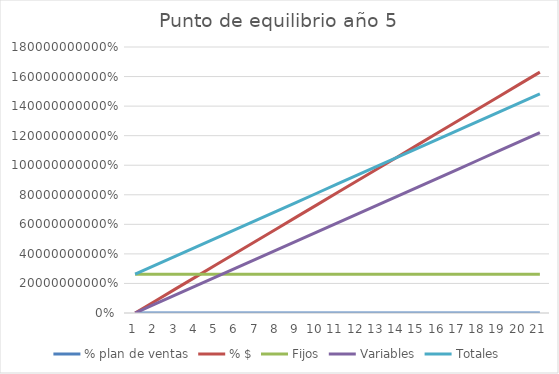
| Category | % plan de ventas | % $ | Fijos | Variables | Totales |
|---|---|---|---|---|---|
| 0 | 0 | 0 | 263004650.022 | 0 | 263004650.022 |
| 1 | 0.05 | 81506250 | 263004650.022 | 61003673.154 | 324008323.176 |
| 2 | 0.1 | 163012500 | 263004650.022 | 122007346.309 | 385011996.33 |
| 3 | 0.15 | 244518750 | 263004650.022 | 183011019.463 | 446015669.485 |
| 4 | 0.2 | 326025000 | 263004650.022 | 244014692.618 | 507019342.639 |
| 5 | 0.25 | 407531250 | 263004650.022 | 305018365.772 | 568023015.794 |
| 6 | 0.3 | 489037500 | 263004650.022 | 366022038.926 | 629026688.948 |
| 7 | 0.35 | 570543750 | 263004650.022 | 427025712.081 | 690030362.102 |
| 8 | 0.4 | 652050000 | 263004650.022 | 488029385.235 | 751034035.257 |
| 9 | 0.45 | 733556250 | 263004650.022 | 549033058.39 | 812037708.411 |
| 10 | 0.5 | 815062500 | 263004650.022 | 610036731.544 | 873041381.565 |
| 11 | 0.55 | 896568750 | 263004650.022 | 671040404.698 | 934045054.72 |
| 12 | 0.6 | 978075000 | 263004650.022 | 732044077.853 | 995048727.874 |
| 13 | 0.65 | 1059581250 | 263004650.022 | 793047751.007 | 1056052401.029 |
| 14 | 0.7 | 1141087500 | 263004650.022 | 854051424.162 | 1117056074.183 |
| 15 | 0.75 | 1222593750 | 263004650.022 | 915055097.316 | 1178059747.337 |
| 16 | 0.8 | 1304100000 | 263004650.022 | 976058770.47 | 1239063420.492 |
| 17 | 0.85 | 1385606250 | 263004650.022 | 1037062443.625 | 1300067093.646 |
| 18 | 0.9 | 1467112500 | 263004650.022 | 1098066116.779 | 1361070766.801 |
| 19 | 0.95 | 1548618750 | 263004650.022 | 1159069789.934 | 1422074439.955 |
| 20 | 1 | 1630125000 | 263004650.022 | 1220073463.088 | 1483078113.109 |